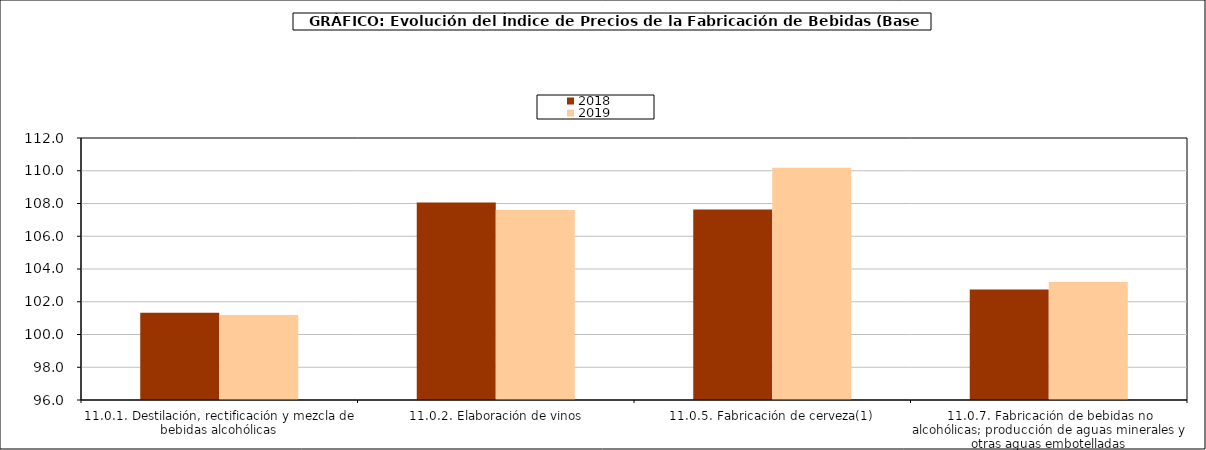
| Category | 2018 | 2019 |
|---|---|---|
| 11.0.1. Destilación, rectificación y mezcla de bebidas alcohólicas | 101.329 | 101.196 |
| 11.0.2. Elaboración de vinos | 108.056 | 107.607 |
| 11.0.5. Fabricación de cerveza(1) | 107.628 | 110.184 |
| 11.0.7. Fabricación de bebidas no alcohólicas; producción de aguas minerales y otras aguas embotelladas | 102.752 | 103.205 |